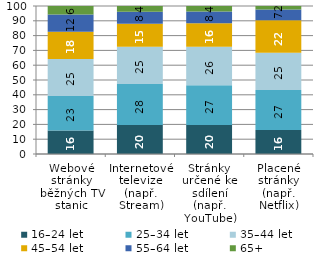
| Category | 16–24 let | 25–34 let | 35–44 let | 45–54 let | 55–64 let | 65+ |
|---|---|---|---|---|---|---|
| Webové stránky běžných TV stanic | 15.908 | 23.338 | 25.022 | 18.284 | 11.74 | 5.703 |
| Internetové televize
(např. Stream) | 19.561 | 27.677 | 25.224 | 15.498 | 8.094 | 3.946 |
| Stránky určené ke sdílení
(např. YouTube) | 19.574 | 26.933 | 26.008 | 15.833 | 7.973 | 3.681 |
| Placené stránky
(např. Netflix) | 16.186 | 26.977 | 25.178 | 22.095 | 7.279 | 2.284 |